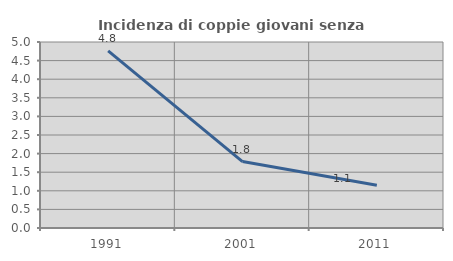
| Category | Incidenza di coppie giovani senza figli |
|---|---|
| 1991.0 | 4.762 |
| 2001.0 | 1.786 |
| 2011.0 | 1.149 |